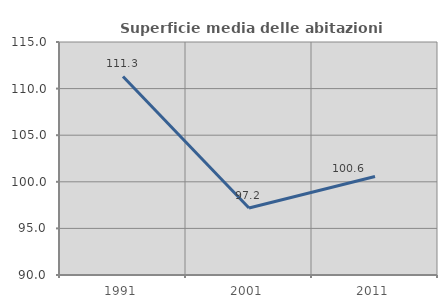
| Category | Superficie media delle abitazioni occupate |
|---|---|
| 1991.0 | 111.308 |
| 2001.0 | 97.186 |
| 2011.0 | 100.564 |